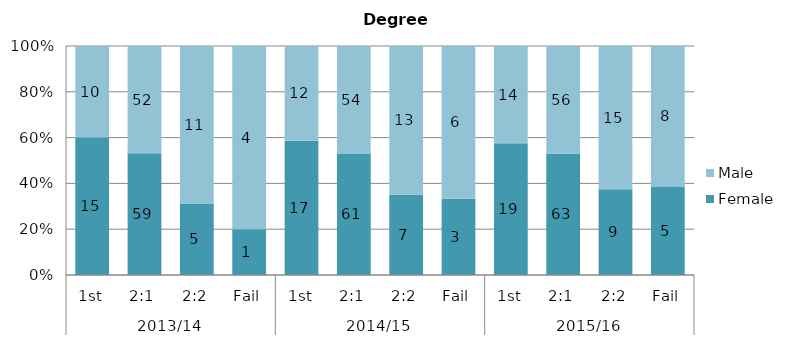
| Category | Female | Male |
|---|---|---|
| 0 | 15 | 10 |
| 1 | 59 | 52 |
| 2 | 5 | 11 |
| 3 | 1 | 4 |
| 4 | 17 | 12 |
| 5 | 61 | 54 |
| 6 | 7 | 13 |
| 7 | 3 | 6 |
| 8 | 19 | 14 |
| 9 | 63 | 56 |
| 10 | 9 | 15 |
| 11 | 5 | 8 |